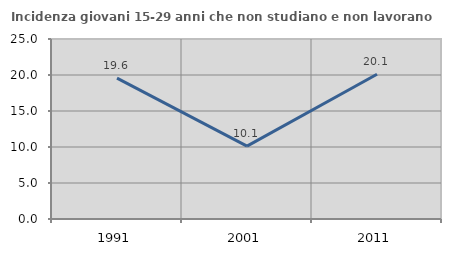
| Category | Incidenza giovani 15-29 anni che non studiano e non lavorano  |
|---|---|
| 1991.0 | 19.565 |
| 2001.0 | 10.121 |
| 2011.0 | 20.103 |